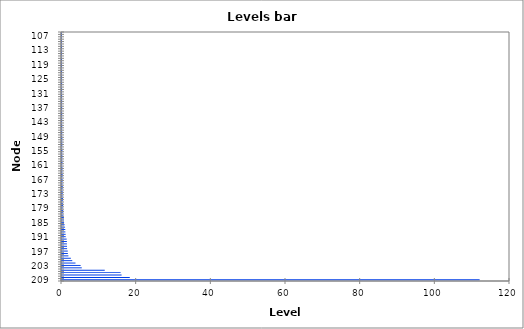
| Category | False |
|---|---|
| 209.0 | 111.864 |
| 208.0 | 18.156 |
| 207.0 | 15.96 |
| 206.0 | 15.706 |
| 205.0 | 11.449 |
| 204.0 | 5.294 |
| 203.0 | 4.986 |
| 202.0 | 3.612 |
| 201.0 | 2.746 |
| 200.0 | 2.371 |
| 199.0 | 1.713 |
| 198.0 | 1.567 |
| 197.0 | 1.545 |
| 196.0 | 1.369 |
| 195.0 | 1.341 |
| 194.0 | 1.316 |
| 193.0 | 1.308 |
| 192.0 | 1.247 |
| 191.0 | 0.998 |
| 190.0 | 0.984 |
| 189.0 | 0.904 |
| 188.0 | 0.886 |
| 187.0 | 0.818 |
| 186.0 | 0.698 |
| 185.0 | 0.557 |
| 184.0 | 0.541 |
| 183.0 | 0.502 |
| 182.0 | 0.387 |
| 181.0 | 0.338 |
| 180.0 | 0.324 |
| 179.0 | 0.305 |
| 178.0 | 0.292 |
| 177.0 | 0.254 |
| 176.0 | 0.253 |
| 175.0 | 0.242 |
| 174.0 | 0.232 |
| 173.0 | 0.226 |
| 172.0 | 0.198 |
| 171.0 | 0.192 |
| 170.0 | 0.184 |
| 169.0 | 0.18 |
| 168.0 | 0.18 |
| 167.0 | 0.178 |
| 166.0 | 0.16 |
| 165.0 | 0.155 |
| 164.0 | 0.145 |
| 163.0 | 0.137 |
| 162.0 | 0.132 |
| 161.0 | 0.123 |
| 160.0 | 0.114 |
| 159.0 | 0.113 |
| 158.0 | 0.113 |
| 157.0 | 0.109 |
| 156.0 | 0.103 |
| 155.0 | 0.101 |
| 154.0 | 0.099 |
| 153.0 | 0.094 |
| 152.0 | 0.094 |
| 151.0 | 0.092 |
| 150.0 | 0.083 |
| 149.0 | 0.068 |
| 148.0 | 0.064 |
| 147.0 | 0.059 |
| 146.0 | 0.056 |
| 145.0 | 0.055 |
| 144.0 | 0.048 |
| 143.0 | 0.047 |
| 142.0 | 0.046 |
| 141.0 | 0.044 |
| 140.0 | 0.043 |
| 139.0 | 0.041 |
| 138.0 | 0.04 |
| 137.0 | 0.038 |
| 136.0 | 0.038 |
| 135.0 | 0.033 |
| 134.0 | 0.032 |
| 133.0 | 0.032 |
| 132.0 | 0.031 |
| 131.0 | 0.03 |
| 130.0 | 0.03 |
| 129.0 | 0.029 |
| 128.0 | 0.028 |
| 127.0 | 0.026 |
| 126.0 | 0.021 |
| 125.0 | 0.021 |
| 124.0 | 0.02 |
| 123.0 | 0.017 |
| 122.0 | 0.016 |
| 121.0 | 0.014 |
| 120.0 | 0.014 |
| 119.0 | 0.013 |
| 118.0 | 0.013 |
| 117.0 | 0.012 |
| 116.0 | 0.011 |
| 115.0 | 0.011 |
| 114.0 | 0.01 |
| 113.0 | 0.009 |
| 112.0 | 0.008 |
| 111.0 | 0.008 |
| 110.0 | 0.007 |
| 109.0 | 0.007 |
| 108.0 | 0.005 |
| 107.0 | 0.002 |
| 106.0 | 0.002 |